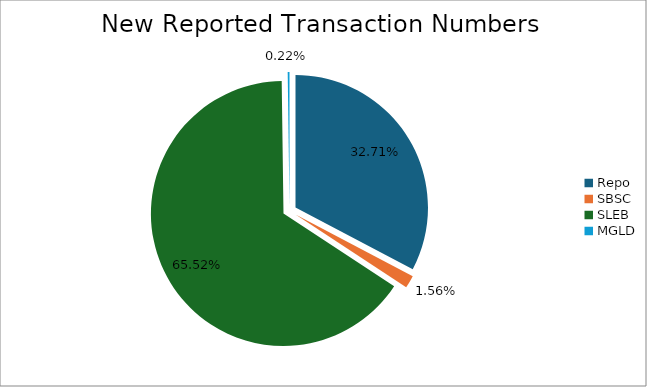
| Category | Series 0 |
|---|---|
| Repo | 467810 |
| SBSC | 22259 |
| SLEB | 936954 |
| MGLD | 3103 |